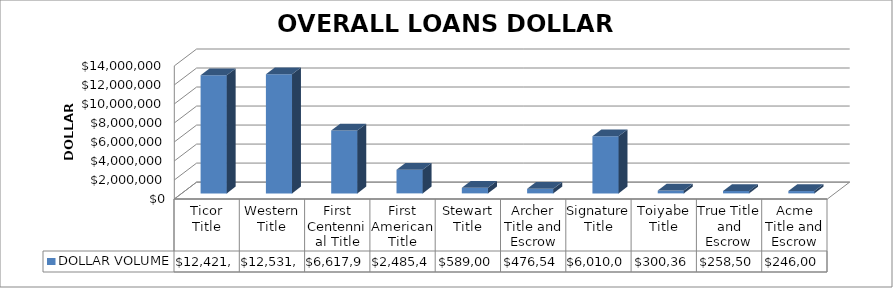
| Category | DOLLAR VOLUME |
|---|---|
| Ticor Title | 12421186 |
| Western Title | 12531926 |
| First Centennial Title | 6617969 |
| First American Title | 2485431 |
| Stewart Title | 589000 |
| Archer Title and Escrow | 476541 |
| Signature Title | 6010000 |
| Toiyabe Title | 300366 |
| True Title and Escrow | 258500 |
| Acme Title and Escrow | 246000 |